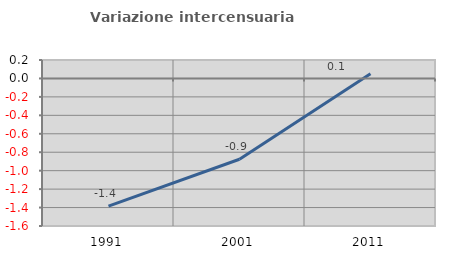
| Category | Variazione intercensuaria annua |
|---|---|
| 1991.0 | -1.385 |
| 2001.0 | -0.876 |
| 2011.0 | 0.051 |